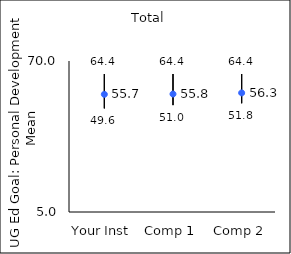
| Category | 25th percentile | 75th percentile | Mean |
|---|---|---|---|
| Your Inst | 49.6 | 64.4 | 55.65 |
| Comp 1 | 51 | 64.4 | 55.79 |
| Comp 2 | 51.8 | 64.4 | 56.27 |